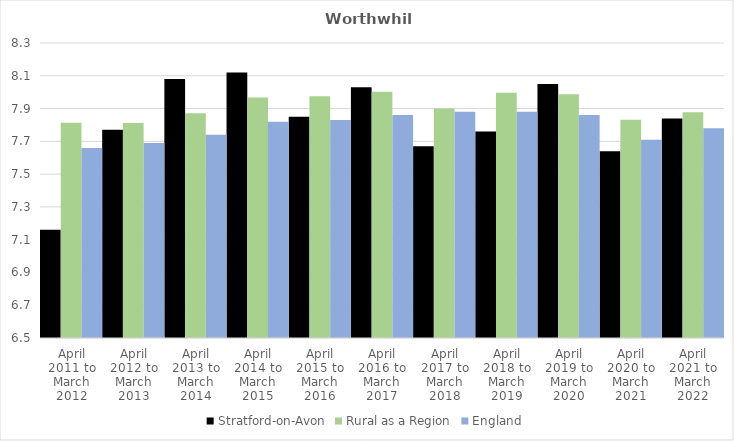
| Category | Stratford-on-Avon | Rural as a Region | England |
|---|---|---|---|
| April 2011 to March 2012 | 7.16 | 7.813 | 7.66 |
| April 2012 to March 2013 | 7.77 | 7.811 | 7.69 |
| April 2013 to March 2014 | 8.08 | 7.871 | 7.74 |
| April 2014 to March 2015 | 8.12 | 7.967 | 7.82 |
| April 2015 to March 2016 | 7.85 | 7.975 | 7.83 |
| April 2016 to March 2017 | 8.03 | 8.002 | 7.86 |
| April 2017 to March 2018 | 7.67 | 7.9 | 7.88 |
| April 2018 to March 2019 | 7.76 | 7.996 | 7.88 |
| April 2019 to March 2020 | 8.05 | 7.988 | 7.86 |
| April 2020 to March 2021 | 7.64 | 7.831 | 7.71 |
| April 2021 to March 2022 | 7.84 | 7.877 | 7.78 |